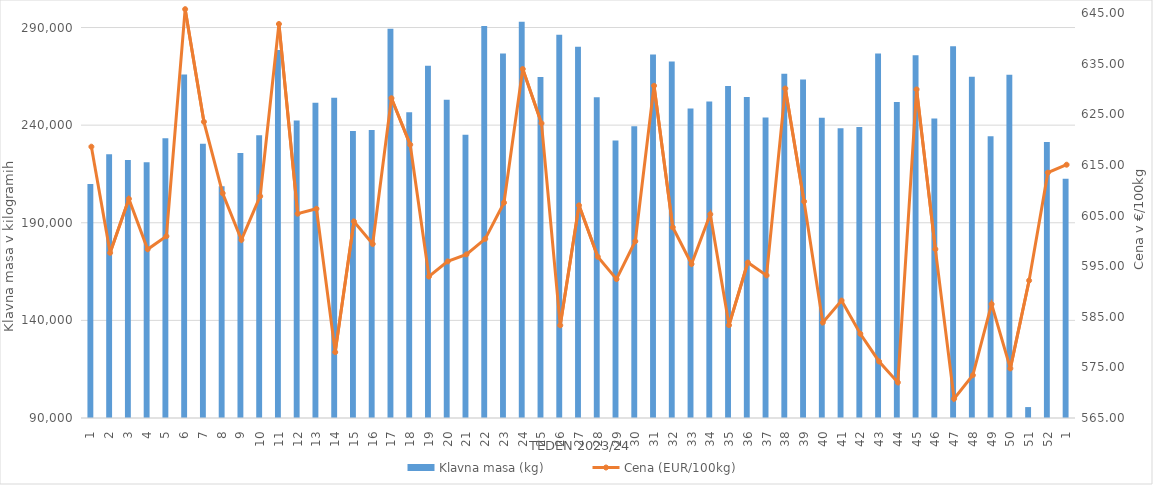
| Category | Klavna masa (kg) |
|---|---|
| 1.0 | 209877 |
| 2.0 | 225045 |
| 3.0 | 222198 |
| 4.0 | 221002 |
| 5.0 | 233306 |
| 6.0 | 265944 |
| 7.0 | 230531 |
| 8.0 | 208699 |
| 9.0 | 225712 |
| 10.0 | 234762 |
| 11.0 | 278467 |
| 12.0 | 242369 |
| 13.0 | 251507 |
| 14.0 | 254072 |
| 15.0 | 236964 |
| 16.0 | 237552 |
| 17.0 | 289400 |
| 18.0 | 246616 |
| 19.0 | 270374 |
| 20.0 | 252984 |
| 21.0 | 235060 |
| 22.0 | 290816 |
| 23.0 | 276702 |
| 24.0 | 292976 |
| 25.0 | 264669 |
| 26.0 | 286237 |
| 27.0 | 280112 |
| 28.0 | 254336 |
| 29.0 | 232178 |
| 30.0 | 239437 |
| 31.0 | 276163 |
| 32.0 | 272647 |
| 33.0 | 248536 |
| 34.0 | 252050 |
| 35.0 | 260110 |
| 36.0 | 254389 |
| 37.0 | 243933 |
| 38.0 | 266321 |
| 39.0 | 263346 |
| 40.0 | 243765 |
| 41.0 | 238404 |
| 42.0 | 239007 |
| 43.0 | 276684 |
| 44.0 | 251832 |
| 45.0 | 275816 |
| 46.0 | 243425 |
| 47.0 | 280350 |
| 48.0 | 264849 |
| 49.0 | 234308 |
| 50.0 | 265786 |
| 51.0 | 95590 |
| 52.0 | 231370 |
| 1.0 | 212581 |